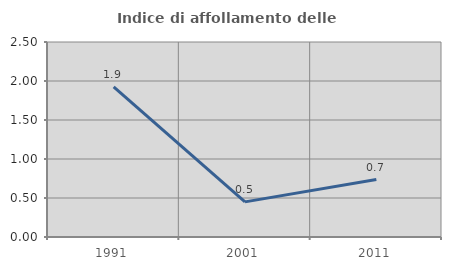
| Category | Indice di affollamento delle abitazioni  |
|---|---|
| 1991.0 | 1.924 |
| 2001.0 | 0.45 |
| 2011.0 | 0.737 |